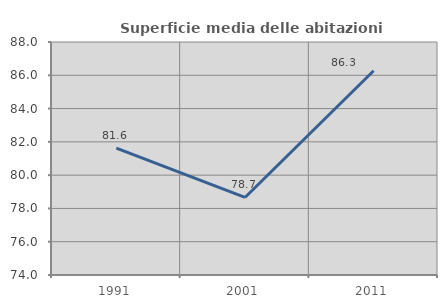
| Category | Superficie media delle abitazioni occupate |
|---|---|
| 1991.0 | 81.623 |
| 2001.0 | 78.659 |
| 2011.0 | 86.271 |